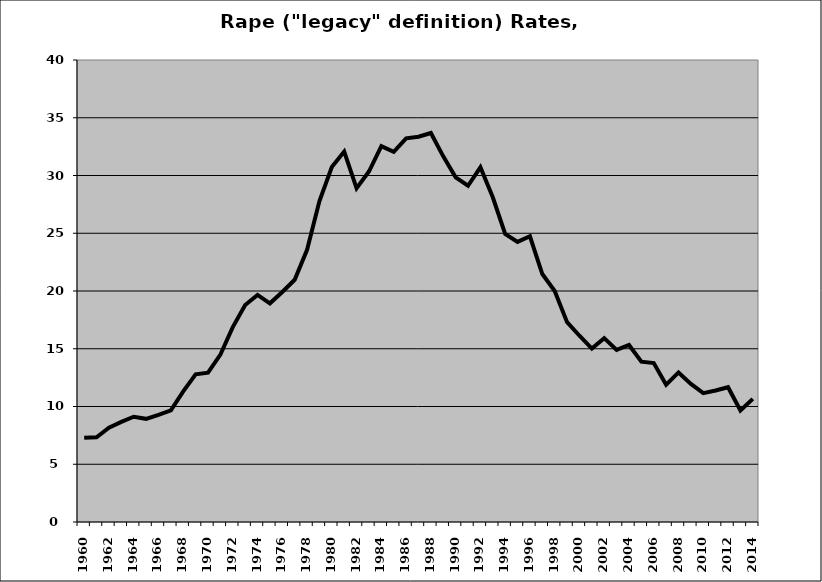
| Category | Rape |
|---|---|
| 1960.0 | 7.286 |
| 1961.0 | 7.335 |
| 1962.0 | 8.167 |
| 1963.0 | 8.671 |
| 1964.0 | 9.114 |
| 1965.0 | 8.931 |
| 1966.0 | 9.278 |
| 1967.0 | 9.667 |
| 1968.0 | 11.317 |
| 1969.0 | 12.787 |
| 1970.0 | 12.932 |
| 1971.0 | 14.493 |
| 1972.0 | 16.873 |
| 1973.0 | 18.788 |
| 1974.0 | 19.659 |
| 1975.0 | 18.931 |
| 1976.0 | 19.915 |
| 1977.0 | 20.971 |
| 1978.0 | 23.57 |
| 1979.0 | 27.782 |
| 1980.0 | 30.74 |
| 1981.0 | 32.077 |
| 1982.0 | 28.892 |
| 1983.0 | 30.343 |
| 1984.0 | 32.548 |
| 1985.0 | 32.055 |
| 1986.0 | 33.215 |
| 1987.0 | 33.355 |
| 1988.0 | 33.679 |
| 1989.0 | 31.657 |
| 1990.0 | 29.844 |
| 1991.0 | 29.111 |
| 1992.0 | 30.71 |
| 1993.0 | 28.113 |
| 1994.0 | 24.949 |
| 1995.0 | 24.254 |
| 1996.0 | 24.737 |
| 1997.0 | 21.47 |
| 1998.0 | 20 |
| 1999.0 | 17.302 |
| 2000.0 | 16.127 |
| 2001.0 | 15.016 |
| 2002.0 | 15.918 |
| 2003.0 | 14.903 |
| 2004.0 | 15.325 |
| 2005.0 | 13.88 |
| 2006.0 | 13.766 |
| 2007.0 | 11.881 |
| 2008.0 | 12.951 |
| 2009.0 | 11.955 |
| 2010.0 | 11.158 |
| 2011.0 | 11.387 |
| 2012.0 | 11.672 |
| 2013.0 | 9.662 |
| 2014.0 | 10.662 |